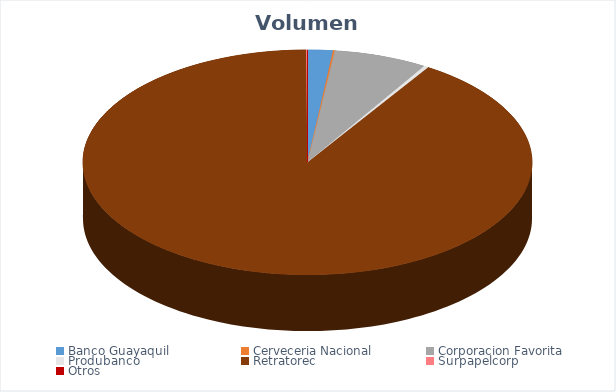
| Category | VOLUMEN ($USD) |
|---|---|
| Banco Guayaquil | 6250.5 |
| Cerveceria Nacional | 460 |
| Corporacion Favorita | 23352.16 |
| Produbanco | 1172.16 |
| Retratorec | 314901 |
| Surpapelcorp | 340 |
| Otros | 33.5 |